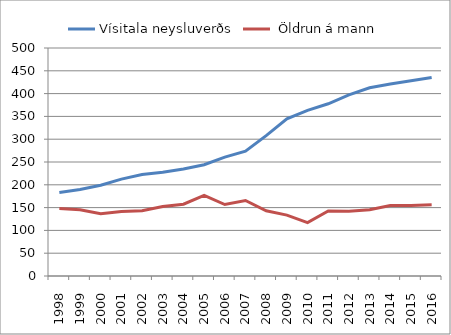
| Category | Vísitala neysluverðs |  Öldrun á mann |
|---|---|---|
| 1998 | 183.3 | 147.9 |
| 1999 | 189.6 | 145.4 |
| 2000 | 199.1 | 136.7 |
| 2001 | 212.4 | 141.5 |
| 2002 | 222.6 | 142.9 |
| 2003 | 227.3 | 152.5 |
| 2004 | 234.6 | 157.5 |
| 2005 | 244.1 | 176.8 |
| 2006 | 260.6 | 156.8 |
| 2007 | 273.7 | 165.6 |
| 2008 | 307.7 | 142.9 |
| 2009 | 344.6 | 133.5 |
| 2010 | 363.2 | 117 |
| 2011 | 377.7 | 142.7 |
| 2012 | 397.3 | 141.8 |
| 2013 | 412.7 | 145.2 |
| 2014 | 421.1 | 154.7 |
| 2015 | 428 | 154.8 |
| 2016 | 435.3 | 156.038 |